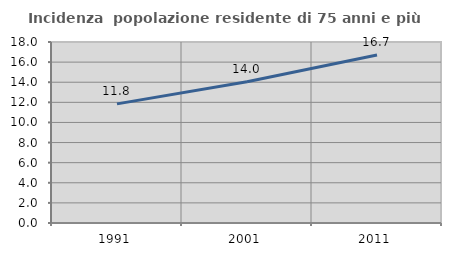
| Category | Incidenza  popolazione residente di 75 anni e più |
|---|---|
| 1991.0 | 11.846 |
| 2001.0 | 14.045 |
| 2011.0 | 16.716 |